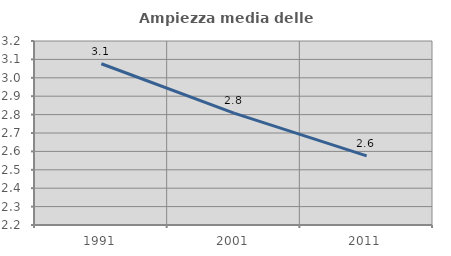
| Category | Ampiezza media delle famiglie |
|---|---|
| 1991.0 | 3.077 |
| 2001.0 | 2.808 |
| 2011.0 | 2.576 |